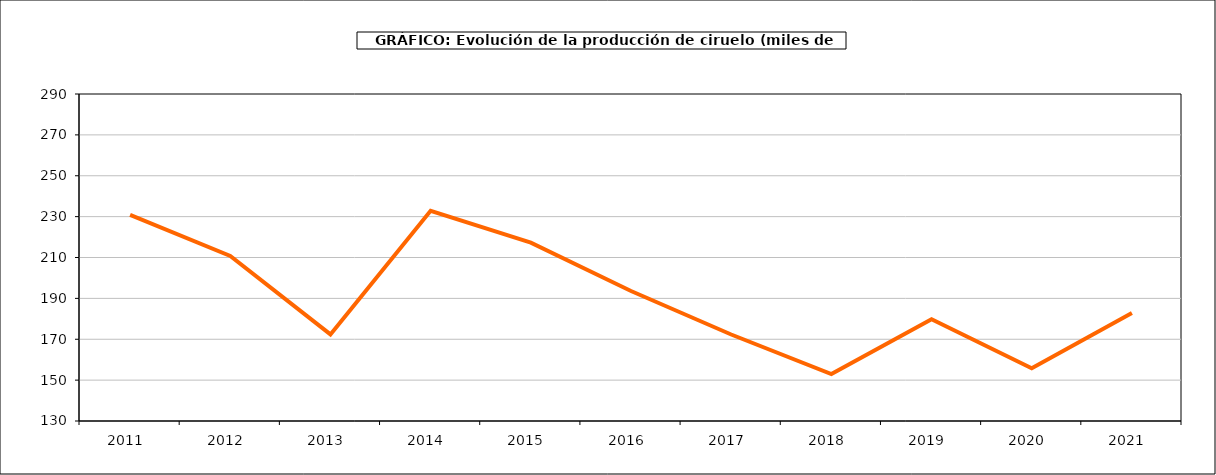
| Category | producción Ciruelo |
|---|---|
| 2011.0 | 230.877 |
| 2012.0 | 210.726 |
| 2013.0 | 172.352 |
| 2014.0 | 232.831 |
| 2015.0 | 217.291 |
| 2016.0 | 193.598 |
| 2017.0 | 172.325 |
| 2018.0 | 152.984 |
| 2019.0 | 179.839 |
| 2020.0 | 155.834 |
| 2021.0 | 182.826 |